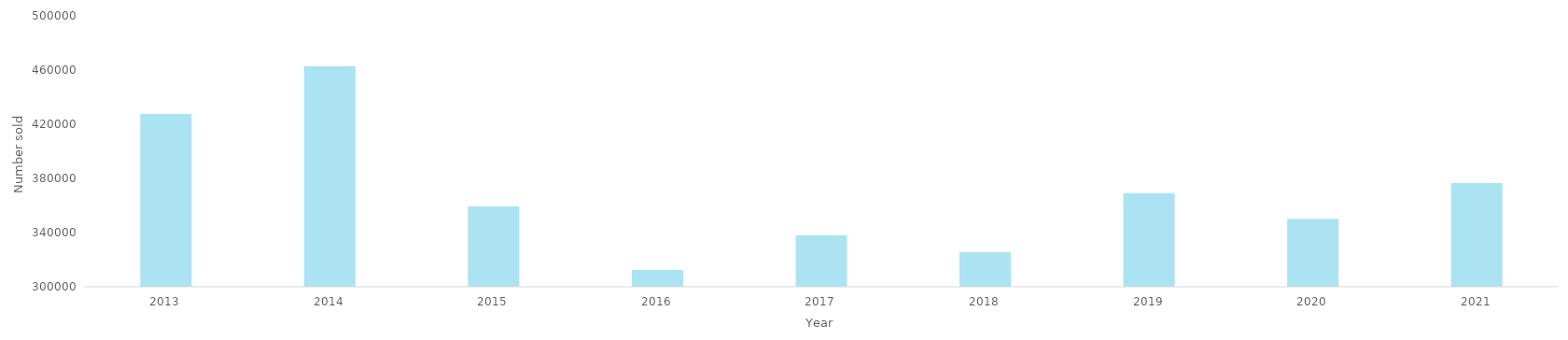
| Category | Series 0 |
|---|---|
| 2013.0 | 427617 |
| 2014.0 | 462728 |
| 2015.0 | 359268 |
| 2016.0 | 312354 |
| 2017.0 | 338032 |
| 2018.0 | 325593 |
| 2019.0 | 369053 |
| 2020.0 | 350194 |
| 2021.0 | 376529 |